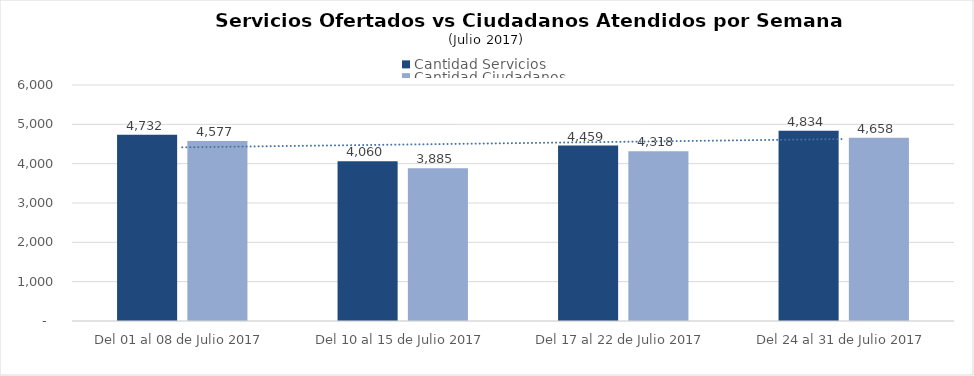
| Category | Cantidad Servicios | Cantidad Ciudadanos |
|---|---|---|
| Del 01 al 08 de Julio 2017 | 4732 | 4577 |
| Del 10 al 15 de Julio 2017 | 4060 | 3885 |
| Del 17 al 22 de Julio 2017 | 4459 | 4318 |
| Del 24 al 31 de Julio 2017 | 4834 | 4658 |